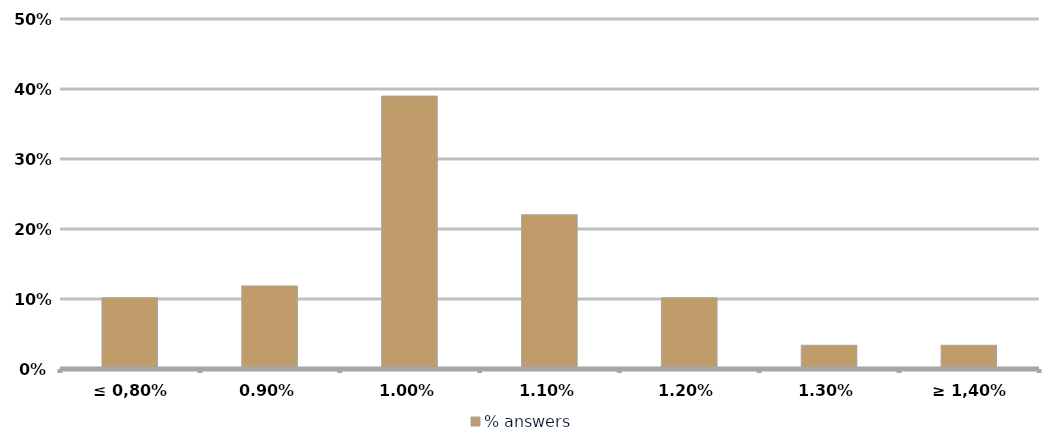
| Category | % answers |
|---|---|
| ≤ 0,80% | 0.102 |
| 0,90% | 0.119 |
| 1,00% | 0.39 |
| 1,10% | 0.22 |
| 1,20% | 0.102 |
| 1,30% | 0.034 |
| ≥ 1,40% | 0.034 |